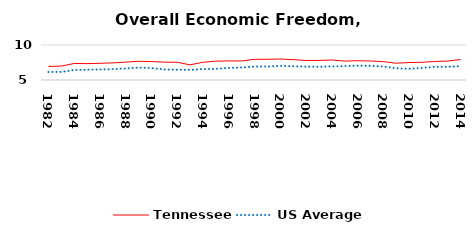
| Category | Tennessee | US Average |
|---|---|---|
| 1982.0 | 6.939 | 6.149 |
| 1983.0 | 6.987 | 6.152 |
| 1984.0 | 7.363 | 6.429 |
| 1985.0 | 7.341 | 6.464 |
| 1986.0 | 7.385 | 6.512 |
| 1987.0 | 7.446 | 6.552 |
| 1988.0 | 7.548 | 6.659 |
| 1989.0 | 7.67 | 6.767 |
| 1990.0 | 7.639 | 6.71 |
| 1991.0 | 7.547 | 6.502 |
| 1992.0 | 7.531 | 6.463 |
| 1993.0 | 7.168 | 6.446 |
| 1994.0 | 7.53 | 6.563 |
| 1995.0 | 7.692 | 6.593 |
| 1996.0 | 7.722 | 6.73 |
| 1997.0 | 7.717 | 6.781 |
| 1998.0 | 7.953 | 6.926 |
| 1999.0 | 7.961 | 6.925 |
| 2000.0 | 7.997 | 7.031 |
| 2001.0 | 7.913 | 6.969 |
| 2002.0 | 7.786 | 6.912 |
| 2003.0 | 7.796 | 6.892 |
| 2004.0 | 7.86 | 6.934 |
| 2005.0 | 7.701 | 6.99 |
| 2006.0 | 7.753 | 7.048 |
| 2007.0 | 7.712 | 7.028 |
| 2008.0 | 7.626 | 6.935 |
| 2009.0 | 7.396 | 6.668 |
| 2010.0 | 7.494 | 6.605 |
| 2011.0 | 7.524 | 6.72 |
| 2012.0 | 7.645 | 6.883 |
| 2013.0 | 7.705 | 6.881 |
| 2014.0 | 7.926 | 6.973 |